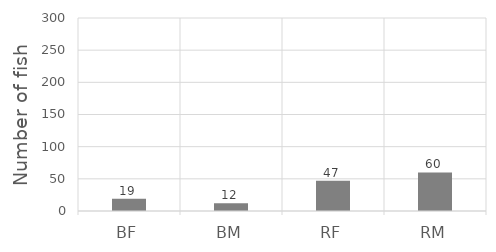
| Category | Series 0 |
|---|---|
| BF | 19 |
| BM | 12 |
| RF | 47 |
| RM | 60 |